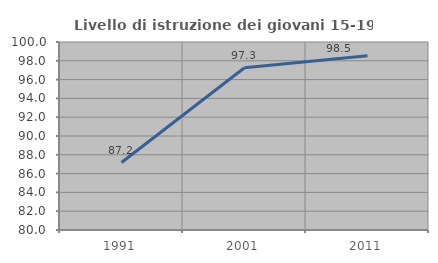
| Category | Livello di istruzione dei giovani 15-19 anni |
|---|---|
| 1991.0 | 87.179 |
| 2001.0 | 97.26 |
| 2011.0 | 98.529 |